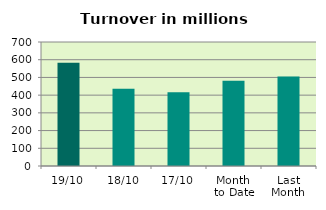
| Category | Series 0 |
|---|---|
| 19/10 | 582.933 |
| 18/10 | 435.592 |
| 17/10 | 416.782 |
| Month 
to Date | 480.999 |
| Last
Month | 505.274 |